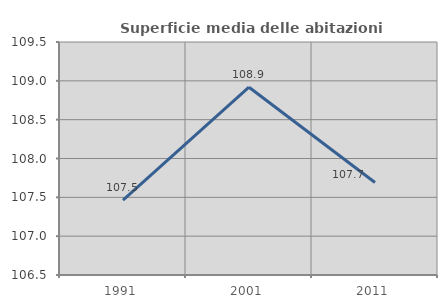
| Category | Superficie media delle abitazioni occupate |
|---|---|
| 1991.0 | 107.463 |
| 2001.0 | 108.918 |
| 2011.0 | 107.692 |